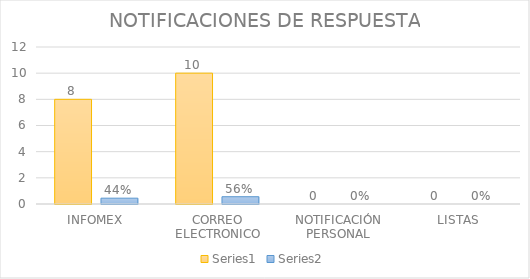
| Category | Series 3 | Series 4 |
|---|---|---|
| INFOMEX | 8 | 0.444 |
| CORREO ELECTRONICO | 10 | 0.556 |
| NOTIFICACIÓN PERSONAL | 0 | 0 |
| LISTAS | 0 | 0 |